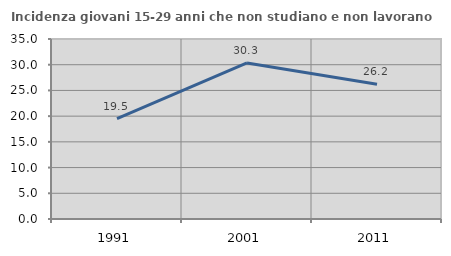
| Category | Incidenza giovani 15-29 anni che non studiano e non lavorano  |
|---|---|
| 1991.0 | 19.507 |
| 2001.0 | 30.339 |
| 2011.0 | 26.181 |